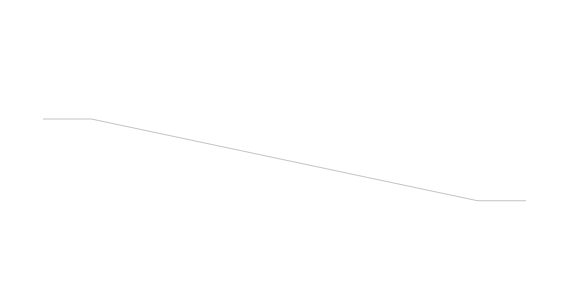
| Category | S1 | S2 | S3 |
|---|---|---|---|
| 0.0 | 1010 | 10 | 910 |
| 10.0 | 1010 | 10 | 910 |
| 90.0 | 1750 | 10 | 170 |
| 100.0 | 1750 | 10 | 170 |